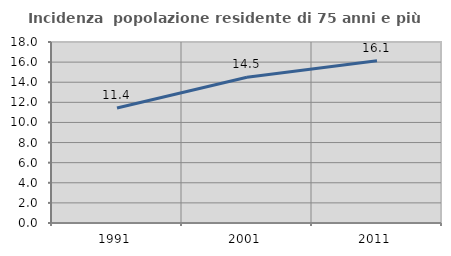
| Category | Incidenza  popolazione residente di 75 anni e più |
|---|---|
| 1991.0 | 11.43 |
| 2001.0 | 14.494 |
| 2011.0 | 16.141 |